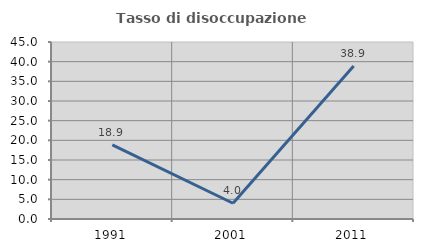
| Category | Tasso di disoccupazione giovanile  |
|---|---|
| 1991.0 | 18.868 |
| 2001.0 | 4 |
| 2011.0 | 38.889 |